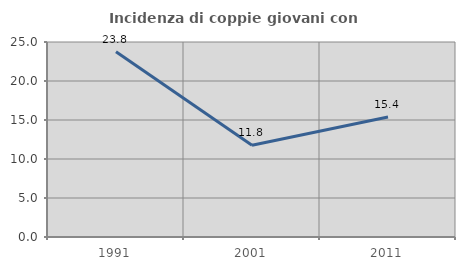
| Category | Incidenza di coppie giovani con figli |
|---|---|
| 1991.0 | 23.75 |
| 2001.0 | 11.765 |
| 2011.0 | 15.385 |